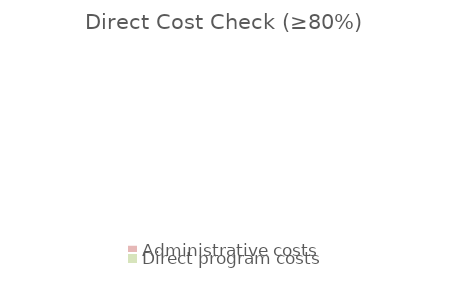
| Category | Series 0 |
|---|---|
| Administrative costs | 0 |
| Direct program costs | 0 |